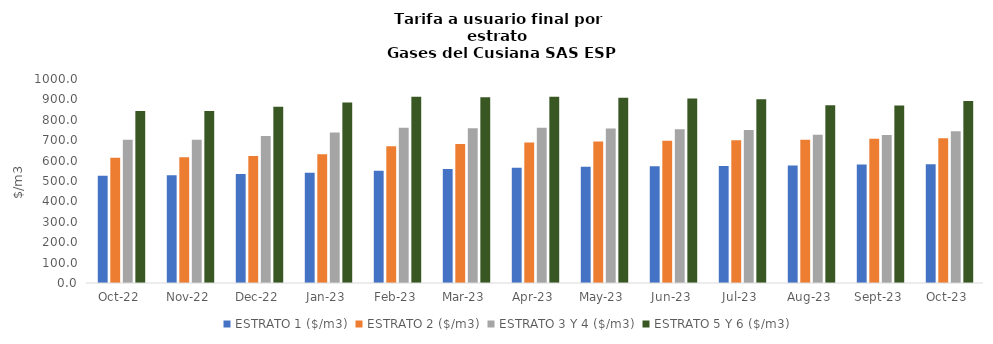
| Category | ESTRATO 1 ($/m3) | ESTRATO 2 ($/m3) | ESTRATO 3 Y 4 ($/m3) | ESTRATO 5 Y 6 ($/m3) |
|---|---|---|---|---|
| 2022-10-01 | 525.98 | 613.66 | 702.69 | 843.228 |
| 2022-11-01 | 527.9 | 615.9 | 702.35 | 842.82 |
| 2022-12-01 | 533.8 | 622.78 | 720.1 | 864.12 |
| 2023-01-01 | 540.64 | 630.76 | 737.34 | 884.808 |
| 2023-02-01 | 550.34 | 670.8 | 760.69 | 912.828 |
| 2023-03-01 | 559.36 | 681.79 | 758.71 | 910.452 |
| 2023-04-01 | 565.3 | 689.03 | 760.69 | 912.828 |
| 2023-05-01 | 569.53 | 694.19 | 757.13 | 908.556 |
| 2023-06-01 | 571.88 | 697.06 | 753.75 | 904.5 |
| 2023-07-01 | 573.63 | 699.2 | 750.21 | 900.252 |
| 2023-08-01 | 576.45 | 702.64 | 726.44 | 871.728 |
| 2023-09-01 | 580.51 | 707.59 | 725.31 | 870.372 |
| 2023-10-01 | 581.75 | 709.1 | 743.81 | 892.572 |